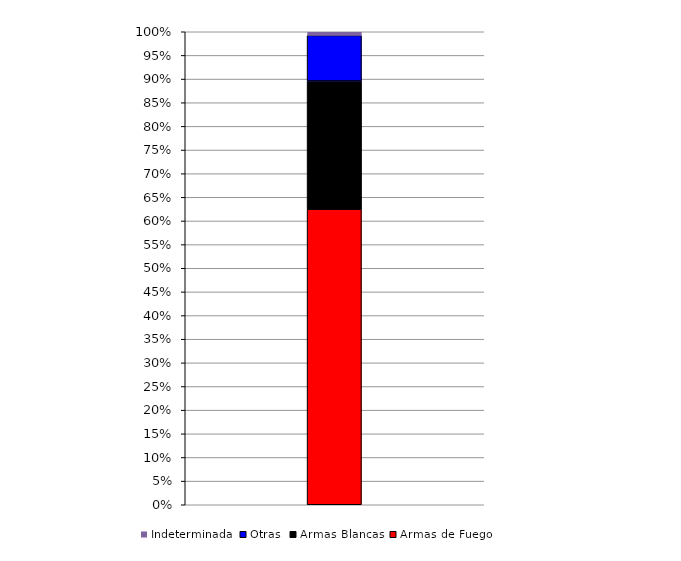
| Category | Armas de Fuego | Armas Blancas | Otras | Indeterminada |
|---|---|---|---|---|
|  | 1130 | 490 | 174 | 14 |